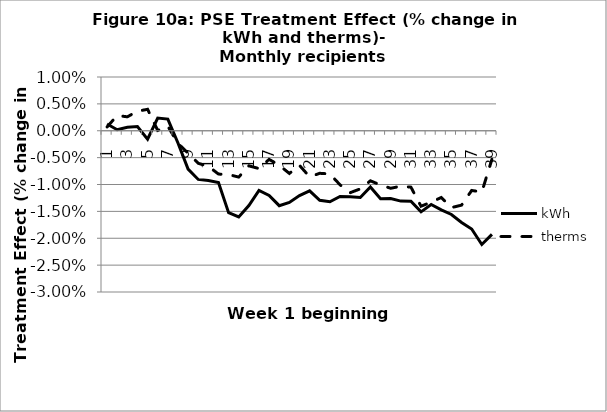
| Category | kWh | therms |
|---|---|---|
| 1.0 | 0.001 | 0.001 |
| 2.0 | 0 | 0.003 |
| 3.0 | 0.001 | 0.003 |
| 4.0 | 0.001 | 0.004 |
| 5.0 | -0.002 | 0.004 |
| 6.0 | 0.002 | 0 |
| 7.0 | 0.002 | 0.001 |
| 8.0 | -0.002 | -0.002 |
| 9.0 | -0.007 | -0.004 |
| 10.0 | -0.009 | -0.006 |
| 11.0 | -0.009 | -0.007 |
| 12.0 | -0.01 | -0.008 |
| 13.0 | -0.015 | -0.008 |
| 14.0 | -0.016 | -0.009 |
| 15.0 | -0.014 | -0.007 |
| 16.0 | -0.011 | -0.007 |
| 17.0 | -0.012 | -0.005 |
| 18.0 | -0.014 | -0.006 |
| 19.0 | -0.013 | -0.008 |
| 20.0 | -0.012 | -0.006 |
| 21.0 | -0.011 | -0.009 |
| 22.0 | -0.013 | -0.008 |
| 23.0 | -0.013 | -0.008 |
| 24.0 | -0.012 | -0.01 |
| 25.0 | -0.012 | -0.012 |
| 26.0 | -0.012 | -0.011 |
| 27.0 | -0.01 | -0.009 |
| 28.0 | -0.013 | -0.01 |
| 29.0 | -0.013 | -0.011 |
| 30.0 | -0.013 | -0.01 |
| 31.0 | -0.013 | -0.01 |
| 32.0 | -0.015 | -0.014 |
| 33.0 | -0.014 | -0.013 |
| 34.0 | -0.015 | -0.012 |
| 35.0 | -0.016 | -0.014 |
| 36.0 | -0.017 | -0.014 |
| 37.0 | -0.018 | -0.011 |
| 38.0 | -0.021 | -0.011 |
| 39.0 | -0.019 | -0.005 |